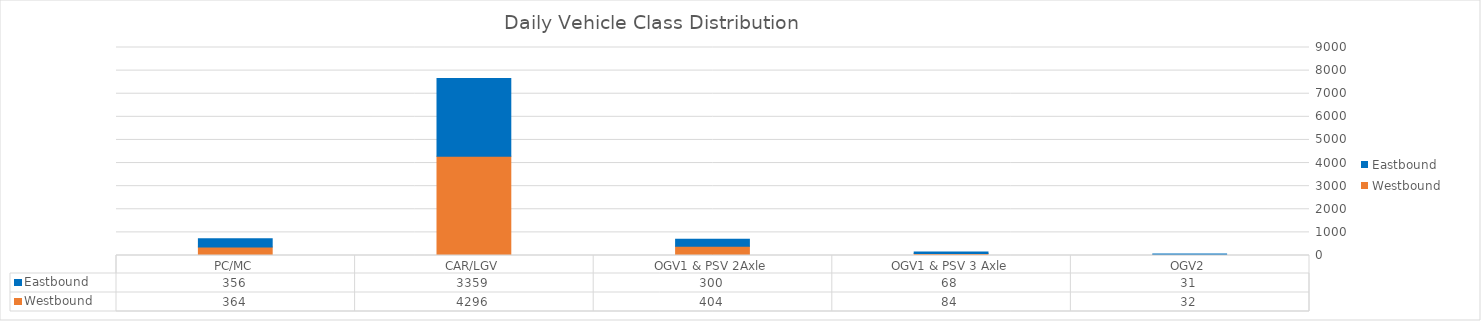
| Category | Westbound | Eastbound |
|---|---|---|
| PC/MC | 364.286 | 356.143 |
| CAR/LGV | 4296 | 3358.714 |
| OGV1 & PSV 2Axle | 404.143 | 300 |
| OGV1 & PSV 3 Axle | 83.714 | 68.143 |
| OGV2 | 32.143 | 31.286 |